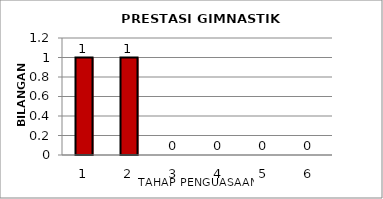
| Category | Series 0 |
|---|---|
| 1.0 | 1 |
| 2.0 | 1 |
| 3.0 | 0 |
| 4.0 | 0 |
| 5.0 | 0 |
| 6.0 | 0 |